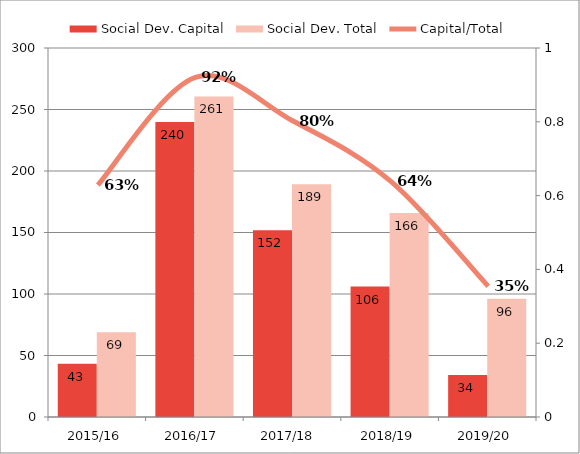
| Category | Social Dev. Capital | Social Dev. Total |
|---|---|---|
| 2015/16 | 43.3 | 68.88 |
| 2016/17 | 239.8 | 260.6 |
| 2017/18  | 151.74 | 189.2 |
| 2018/19 | 106 | 165.85 |
| 2019/20 | 34.08 | 96.23 |